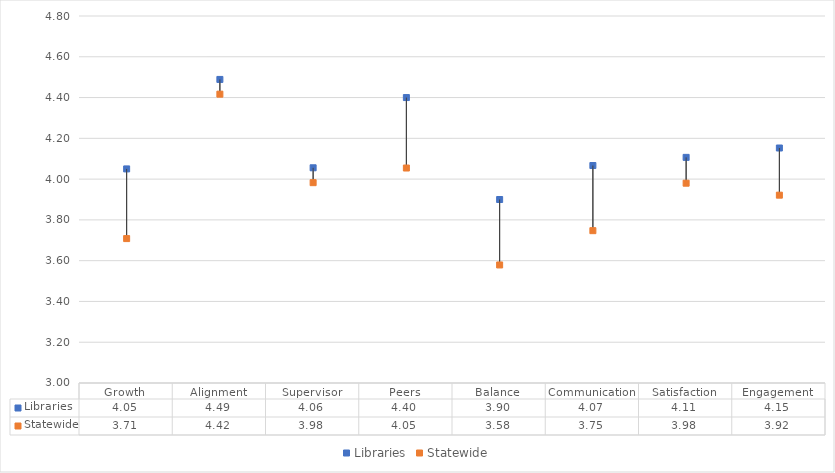
| Category | Libraries | Statewide |
|---|---|---|
| Growth | 4.05 | 3.708 |
| Alignment | 4.489 | 4.417 |
| Supervisor | 4.056 | 3.983 |
| Peers | 4.4 | 4.054 |
| Balance | 3.9 | 3.579 |
| Communication | 4.067 | 3.747 |
| Satisfaction | 4.107 | 3.98 |
| Engagement | 4.153 | 3.921 |